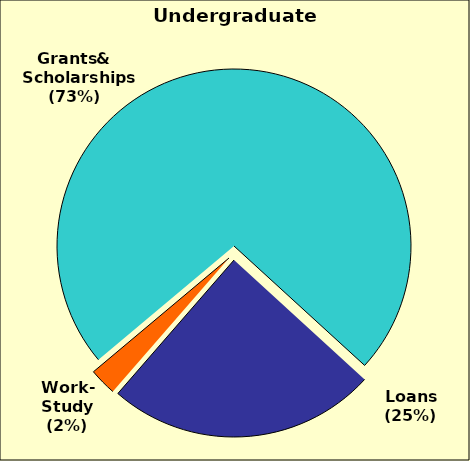
| Category | Series 0 |
|---|---|
| 0 | 0.729 |
| 1 | 0.246 |
| 2 | 0.025 |